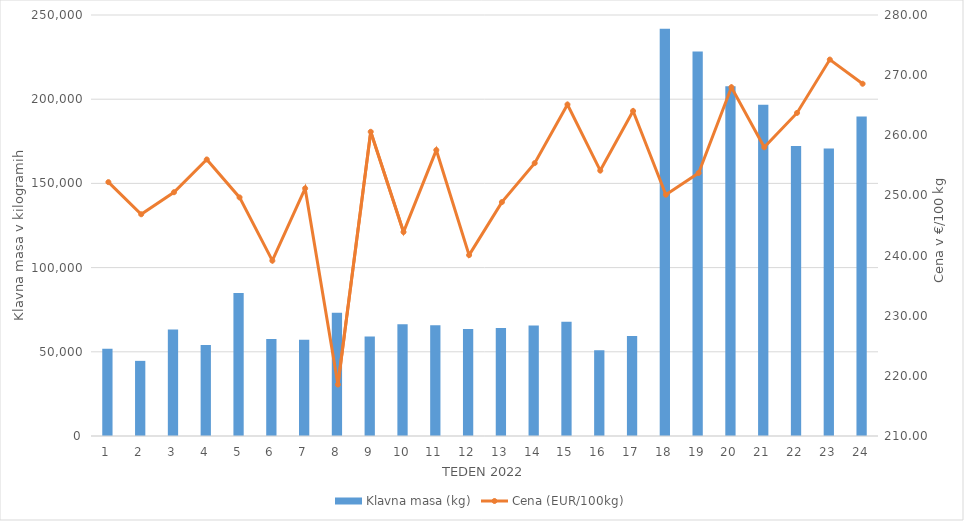
| Category | Klavna masa (kg) |
|---|---|
| 1.0 | 51818 |
| 2.0 | 44619 |
| 3.0 | 63233 |
| 4.0 | 53993 |
| 5.0 | 84871 |
| 6.0 | 57648 |
| 7.0 | 57159 |
| 8.0 | 73139 |
| 9.0 | 59056 |
| 10.0 | 66417 |
| 11.0 | 65723 |
| 12.0 | 63530 |
| 13.0 | 64069 |
| 14.0 | 65564 |
| 15.0 | 67787 |
| 16.0 | 50958 |
| 17.0 | 59387 |
| 18.0 | 241833 |
| 19.0 | 228389 |
| 20.0 | 207661 |
| 21.0 | 196732 |
| 22.0 | 172190 |
| 23.0 | 170751 |
| 24.0 | 189775 |